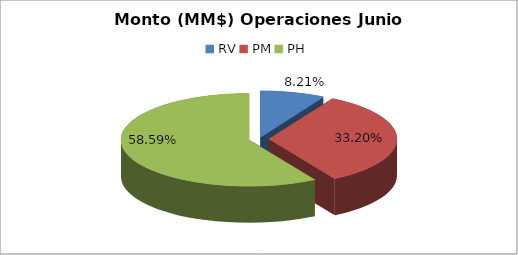
| Category | Series 0 |
|---|---|
| RV | 1039238.343 |
| PM | 4203748.491 |
| PH | 7419437.742 |